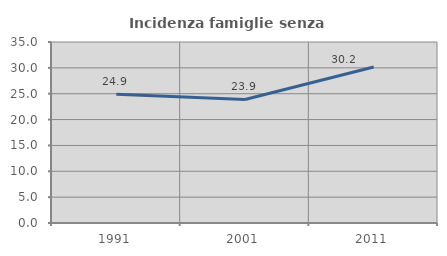
| Category | Incidenza famiglie senza nuclei |
|---|---|
| 1991.0 | 24.905 |
| 2001.0 | 23.888 |
| 2011.0 | 30.172 |